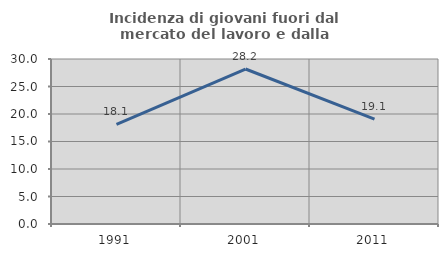
| Category | Incidenza di giovani fuori dal mercato del lavoro e dalla formazione  |
|---|---|
| 1991.0 | 18.108 |
| 2001.0 | 28.181 |
| 2011.0 | 19.075 |